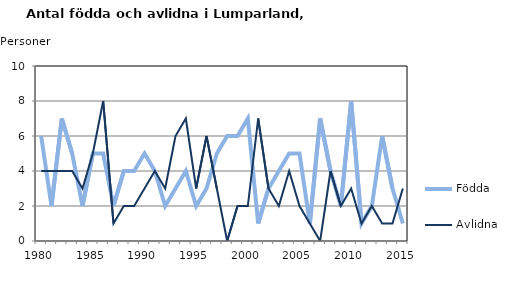
| Category | Födda | Avlidna |
|---|---|---|
| 1980.0 | 6 | 4 |
| 1981.0 | 2 | 4 |
| 1982.0 | 7 | 4 |
| 1983.0 | 5 | 4 |
| 1984.0 | 2 | 3 |
| 1985.0 | 5 | 5 |
| 1986.0 | 5 | 8 |
| 1987.0 | 2 | 1 |
| 1988.0 | 4 | 2 |
| 1989.0 | 4 | 2 |
| 1990.0 | 5 | 3 |
| 1991.0 | 4 | 4 |
| 1992.0 | 2 | 3 |
| 1993.0 | 3 | 6 |
| 1994.0 | 4 | 7 |
| 1995.0 | 2 | 3 |
| 1996.0 | 3 | 6 |
| 1997.0 | 5 | 3 |
| 1998.0 | 6 | 0 |
| 1999.0 | 6 | 2 |
| 2000.0 | 7 | 2 |
| 2001.0 | 1 | 7 |
| 2002.0 | 3 | 3 |
| 2003.0 | 4 | 2 |
| 2004.0 | 5 | 4 |
| 2005.0 | 5 | 2 |
| 2006.0 | 1 | 1 |
| 2007.0 | 7 | 0 |
| 2008.0 | 4 | 4 |
| 2009.0 | 2 | 2 |
| 2010.0 | 8 | 3 |
| 2011.0 | 1 | 1 |
| 2012.0 | 2 | 2 |
| 2013.0 | 6 | 1 |
| 2014.0 | 3 | 1 |
| 2015.0 | 1 | 3 |